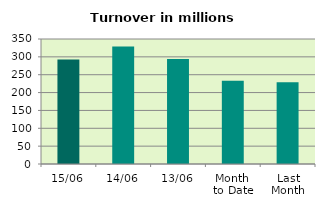
| Category | Series 0 |
|---|---|
| 15/06 | 292.853 |
| 14/06 | 329.052 |
| 13/06 | 293.849 |
| Month 
to Date | 233.422 |
| Last
Month | 228.645 |